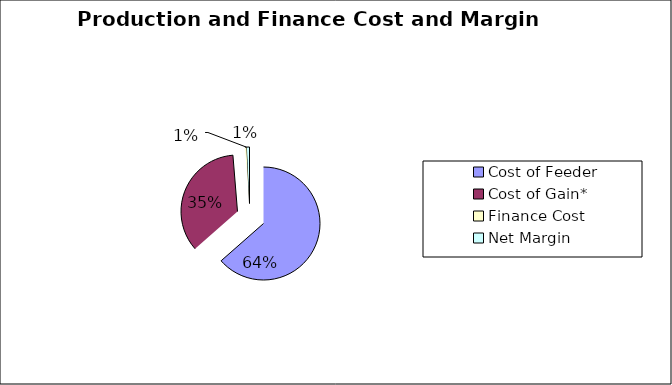
| Category | $/Head |
|---|---|
| Cost of Feeder | 1240 |
| Cost of Gain*  | 687.01 |
| Finance Cost | 10.838 |
| Net Margin | 14.394 |